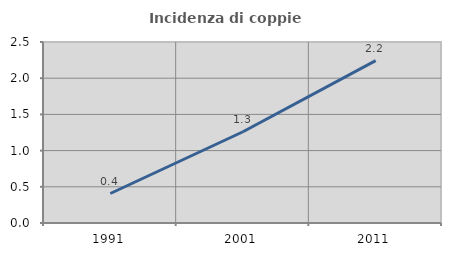
| Category | Incidenza di coppie miste |
|---|---|
| 1991.0 | 0.407 |
| 2001.0 | 1.261 |
| 2011.0 | 2.242 |